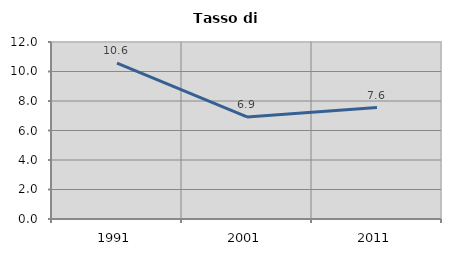
| Category | Tasso di disoccupazione   |
|---|---|
| 1991.0 | 10.563 |
| 2001.0 | 6.923 |
| 2011.0 | 7.558 |